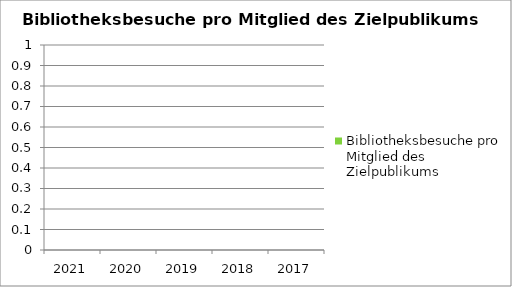
| Category | Bibliotheksbesuche pro Mitglied des Zielpublikums |
|---|---|
| 2021.0 | 0 |
| 2020.0 | 0 |
| 2019.0 | 0 |
| 2018.0 | 0 |
| 2017.0 | 0 |